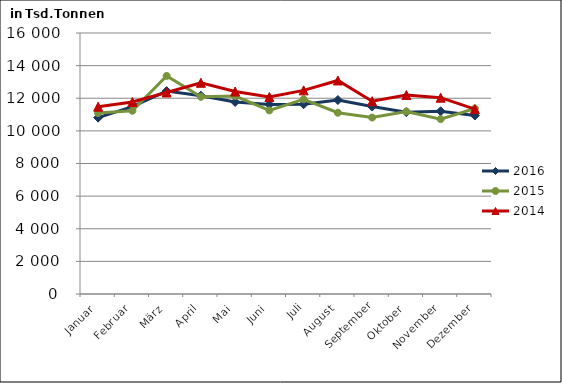
| Category | 2016 | 2015 | 2014 |
|---|---|---|---|
| Januar | 10811.685 | 11089.371 | 11483.064 |
| Februar | 11480.631 | 11233.202 | 11771.027 |
| März | 12438.691 | 13370.037 | 12352.884 |
| April | 12157.936 | 12088.081 | 12947.646 |
| Mai | 11770.352 | 12130.812 | 12413.614 |
| Juni | 11618.936 | 11254.555 | 12074.912 |
| Juli | 11632.772 | 11934.829 | 12482.909 |
| August | 11889.738 | 11113.407 | 13089.657 |
| September | 11492.729 | 10817.107 | 11818.844 |
| Oktober | 11146.784 | 11183.561 | 12198.116 |
| November | 11203.61 | 10721.61 | 12033.776 |
| Dezember | 10941.578 | 11374.913 | 11333.697 |